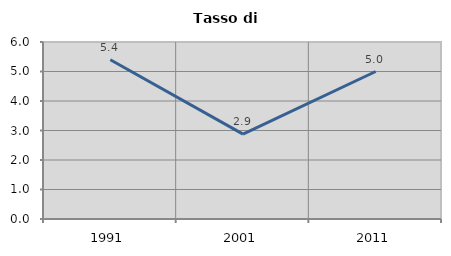
| Category | Tasso di disoccupazione   |
|---|---|
| 1991.0 | 5.398 |
| 2001.0 | 2.878 |
| 2011.0 | 5 |